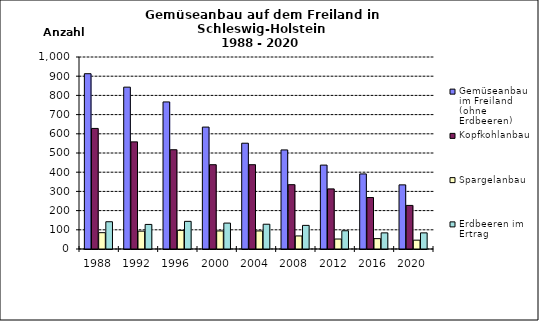
| Category | Gemüseanbau im Freiland (ohne Erdbeeren) | Kopfkohlanbau | Spargelanbau | Erdbeeren im Ertrag |
|---|---|---|---|---|
| 1988.0 | 913 | 628 | 85 | 142 |
| 1992.0 | 843 | 558 | 93 | 128 |
| 1996.0 | 766 | 517 | 97 | 144 |
| 2000.0 | 635 | 439 | 94 | 135 |
| 2004.0 | 551 | 439 | 94 | 129 |
| 2008.0 | 516 | 335 | 68 | 123 |
| 2012.0 | 437 | 313 | 52 | 95 |
| 2016.0 | 391 | 268 | 54 | 84 |
| 2020.0 | 334 | 227 | 46 | 84 |